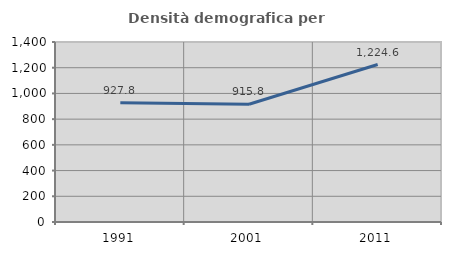
| Category | Densità demografica |
|---|---|
| 1991.0 | 927.819 |
| 2001.0 | 915.775 |
| 2011.0 | 1224.626 |